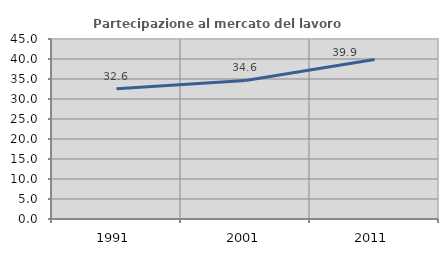
| Category | Partecipazione al mercato del lavoro  femminile |
|---|---|
| 1991.0 | 32.586 |
| 2001.0 | 34.641 |
| 2011.0 | 39.885 |